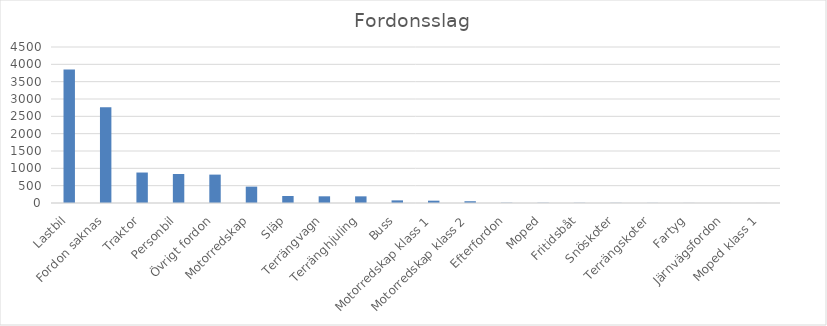
| Category | Summa |
|---|---|
| Lastbil | 3848 |
| Fordon saknas | 2762 |
| Traktor | 879 |
| Personbil | 836 |
| Övrigt fordon | 819 |
| Motorredskap | 472 |
| Släp | 202 |
| Terrängvagn | 193 |
| Terränghjuling | 192 |
| Buss | 76 |
| Motorredskap klass 1 | 67 |
| Motorredskap klass 2 | 51 |
| Efterfordon | 7 |
| Moped | 6 |
| Fritidsbåt | 5 |
| Snöskoter | 4 |
| Terrängskoter | 3 |
| Fartyg | 2 |
| Järnvägsfordon | 1 |
| Moped klass 1 | 1 |